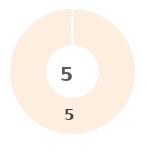
| Category | Series 0 |
|---|---|
| 0 | 0 |
| 1 | 0 |
| 2 | 0 |
| 3 | 0 |
| 4 | 5 |